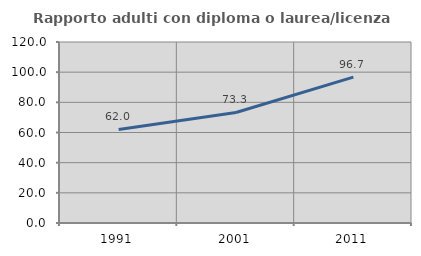
| Category | Rapporto adulti con diploma o laurea/licenza media  |
|---|---|
| 1991.0 | 62.044 |
| 2001.0 | 73.267 |
| 2011.0 | 96.698 |